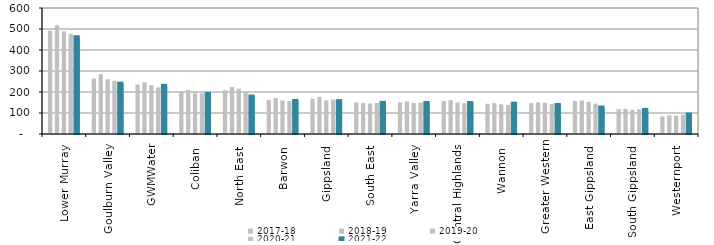
| Category | 2017-18 | 2018-19 | 2019-20 | 2020-21 | 2021-22 |
|---|---|---|---|---|---|
| Lower Murray  | 492.264 | 518.556 | 488.975 | 477.061 | 460.945 |
| Goulburn Valley  | 263.621 | 285.157 | 260.849 | 253.89 | 239.594 |
| GWMWater | 235.605 | 246.447 | 232.754 | 221.402 | 229.511 |
| Coliban  | 200.395 | 209.742 | 194.247 | 193.307 | 191.099 |
| North East  | 208.376 | 223.79 | 215.398 | 199.939 | 178.515 |
| Barwon  | 162.684 | 171.116 | 159.665 | 156.84 | 157.421 |
| Gippsland  | 167.811 | 176.608 | 160.564 | 163.972 | 156.377 |
| South East  | 150.292 | 147.937 | 144.78 | 147.551 | 148.361 |
| Yarra Valley  | 150.6 | 154.766 | 147.573 | 148.976 | 147.707 |
| Central Highlands  | 156.994 | 161.029 | 150.933 | 146.681 | 147.009 |
| Wannon  | 144.069 | 147.21 | 141.166 | 138.754 | 144.456 |
| Greater Western | 147.142 | 151.016 | 149.39 | 143.124 | 138.429 |
| East Gippsland  | 157.422 | 159.875 | 152.937 | 144.969 | 126.232 |
| South Gippsland  | 118.465 | 119.476 | 115.019 | 118.092 | 114.74 |
| Westernport  | 83.629 | 89.309 | 87.451 | 91.64 | 92.409 |